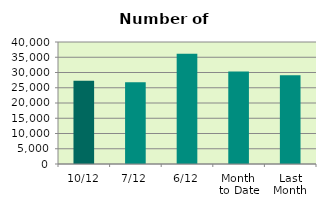
| Category | Series 0 |
|---|---|
| 10/12 | 27308 |
| 7/12 | 26784 |
| 6/12 | 36140 |
| Month 
to Date | 30287.667 |
| Last
Month | 29125.182 |